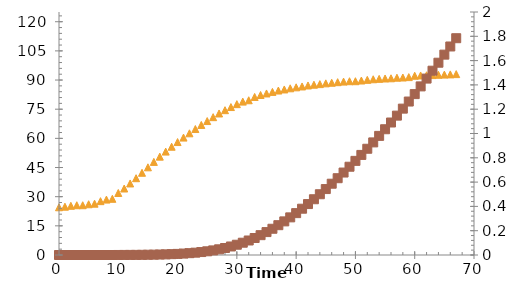
| Category | Series 0 |
|---|---|
| 0.0 | 24.55 |
| 1.0 | 24.85 |
| 2.0 | 25.3 |
| 3.0 | 25.6 |
| 4.0 | 25.6 |
| 5.0 | 26.1 |
| 6.0 | 26.4 |
| 7.0 | 27.7 |
| 8.0 | 28.5 |
| 9.0 | 28.9 |
| 10.0 | 31.9 |
| 11.0 | 34.2 |
| 12.0 | 36.8 |
| 13.0 | 39.5 |
| 14.0 | 42.3 |
| 15.0 | 45.1 |
| 16.0 | 47.9 |
| 17.0 | 50.6 |
| 18.0 | 53.2 |
| 19.0 | 55.7 |
| 20.0 | 58.1 |
| 21.0 | 60.4 |
| 22.0 | 62.6 |
| 23.0 | 64.8 |
| 24.0 | 66.9 |
| 25.0 | 68.9 |
| 26.0 | 70.9 |
| 27.0 | 72.8 |
| 28.0 | 74.5 |
| 29.0 | 76.1 |
| 30.0 | 77.6 |
| 31.0 | 78.9 |
| 32.0 | 79.6 |
| 33.0 | 81.3 |
| 34.0 | 82.3 |
| 35.0 | 83.1 |
| 36.0 | 83.9 |
| 37.0 | 84.6 |
| 38.0 | 85.15 |
| 39.0 | 85.75 |
| 40.0 | 86.25 |
| 41.0 | 86.7 |
| 42.0 | 87.2 |
| 43.0 | 87.6 |
| 44.0 | 87.9 |
| 45.0 | 88.3 |
| 46.0 | 88.6 |
| 47.0 | 88.9 |
| 48.0 | 89.2 |
| 49.0 | 89.4 |
| 50.0 | 89.4 |
| 51.0 | 89.75 |
| 52.0 | 90.1 |
| 53.0 | 90.4 |
| 54.0 | 90.6 |
| 55.0 | 90.8 |
| 56.0 | 90.9 |
| 57.0 | 91.2 |
| 58.0 | 91.3 |
| 59.0 | 91.5 |
| 60.0 | 92.2 |
| 61.0 | 92.35 |
| 62.0 | 92.45 |
| 63.0 | 92.55 |
| 64.0 | 92.7 |
| 65.0 | 92.8 |
| 66.0 | 92.9 |
| 67.0 | 93.05 |